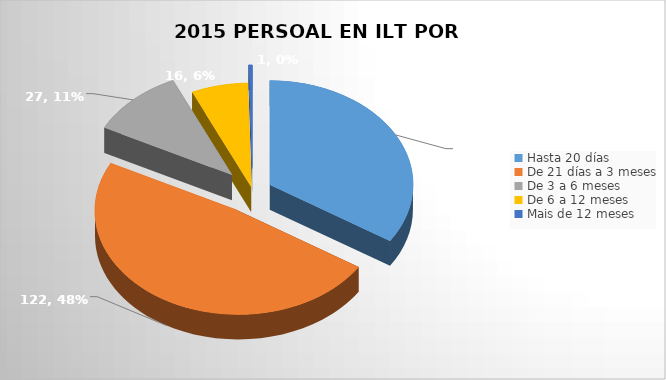
| Category | Series 0 |
|---|---|
| Hasta 20 días | 86 |
| De 21 días a 3 meses | 122 |
| De 3 a 6 meses | 27 |
| De 6 a 12 meses | 16 |
| Mais de 12 meses | 1 |